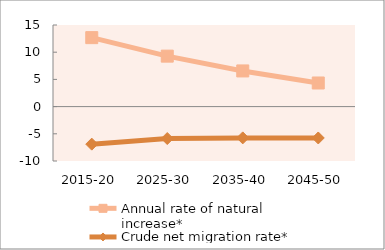
| Category | Annual rate of natural increase* | Crude net migration rate* |
|---|---|---|
| 2015-20 | 12.679 | -6.902 |
| 2025-30 | 9.276 | -5.868 |
| 2035-40 | 6.557 | -5.75 |
| 2045-50 | 4.341 | -5.767 |